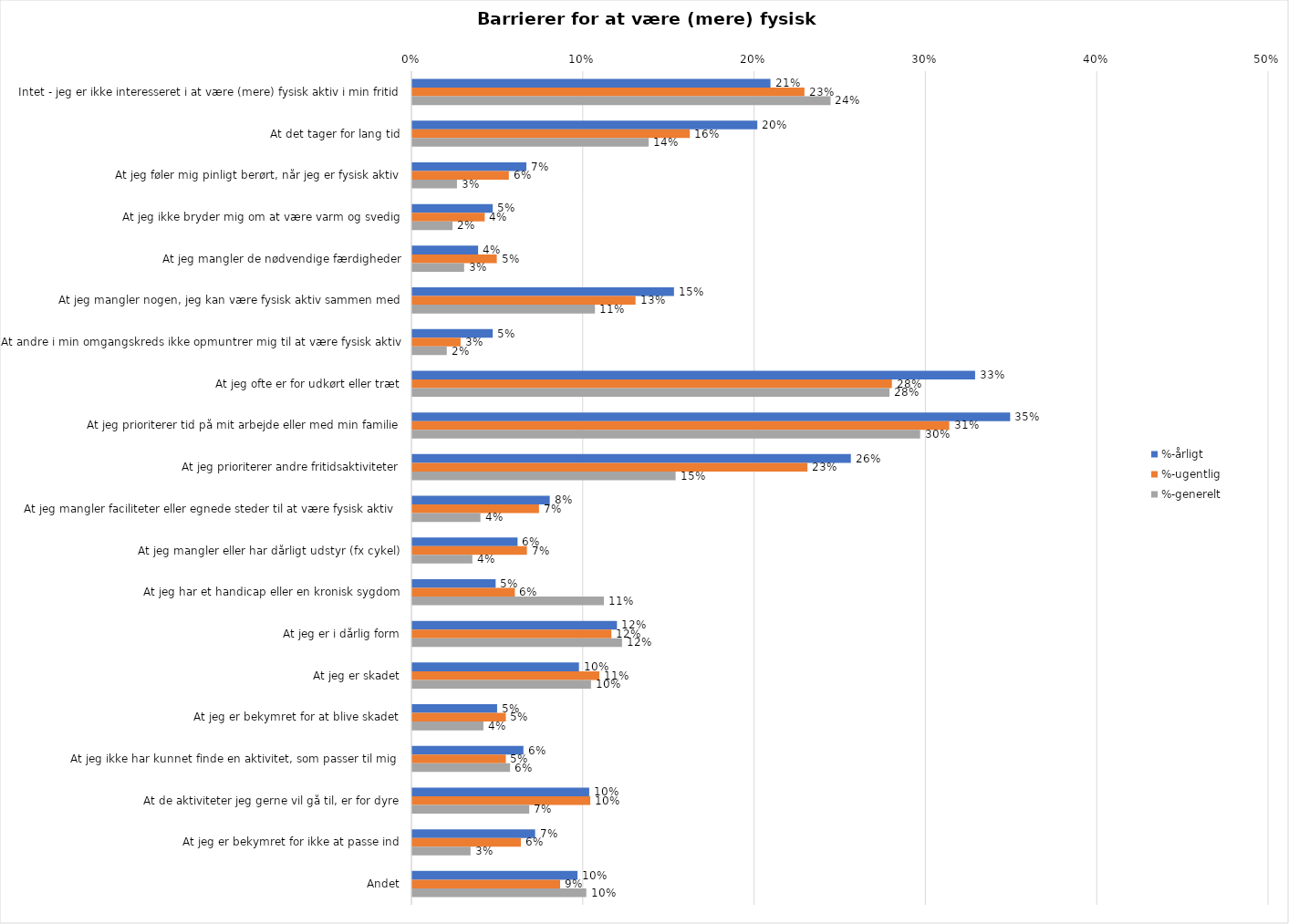
| Category | %-årligt | %-ugentlig | %-generelt |
|---|---|---|---|
| Intet - jeg er ikke interesseret i at være (mere) fysisk aktiv i min fritid | 0.209 | 0.229 | 0.244 |
| At det tager for lang tid | 0.201 | 0.162 | 0.138 |
| At jeg føler mig pinligt berørt, når jeg er fysisk aktiv | 0.067 | 0.056 | 0.026 |
| At jeg ikke bryder mig om at være varm og svedig | 0.047 | 0.042 | 0.023 |
| At jeg mangler de nødvendige færdigheder | 0.038 | 0.049 | 0.03 |
| At jeg mangler nogen, jeg kan være fysisk aktiv sammen med | 0.153 | 0.13 | 0.107 |
| At andre i min omgangskreds ikke opmuntrer mig til at være fysisk aktiv | 0.047 | 0.028 | 0.02 |
| At jeg ofte er for udkørt eller træt | 0.328 | 0.28 | 0.279 |
| At jeg prioriterer tid på mit arbejde eller med min familie | 0.349 | 0.313 | 0.296 |
| At jeg prioriterer andre fritidsaktiviteter | 0.256 | 0.231 | 0.154 |
| At jeg mangler faciliteter eller egnede steder til at være fysisk aktiv  | 0.08 | 0.074 | 0.04 |
| At jeg mangler eller har dårligt udstyr (fx cykel) | 0.061 | 0.067 | 0.035 |
| At jeg har et handicap eller en kronisk sygdom | 0.049 | 0.06 | 0.112 |
| At jeg er i dårlig form | 0.119 | 0.116 | 0.122 |
| At jeg er skadet | 0.097 | 0.109 | 0.104 |
| At jeg er bekymret for at blive skadet | 0.049 | 0.055 | 0.041 |
| At jeg ikke har kunnet finde en aktivitet, som passer til mig  | 0.065 | 0.055 | 0.057 |
| At de aktiviteter jeg gerne vil gå til, er for dyre | 0.103 | 0.104 | 0.068 |
| At jeg er bekymret for ikke at passe ind | 0.072 | 0.063 | 0.034 |
| Andet | 0.096 | 0.086 | 0.102 |